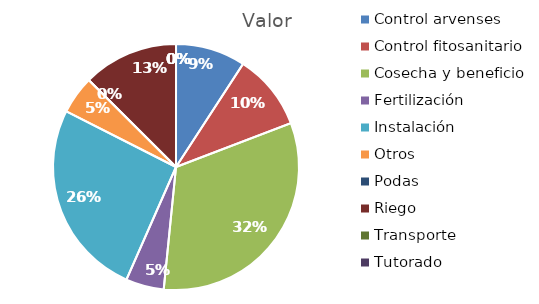
| Category | Valor |
|---|---|
| Control arvenses | 624877 |
| Control fitosanitario | 681684 |
| Cosecha y beneficio | 2205000 |
| Fertilización | 340842 |
| Instalación | 1761017 |
| Otros | 340842 |
| Podas | 0 |
| Riego | 852105 |
| Transporte | 0 |
| Tutorado | 0 |